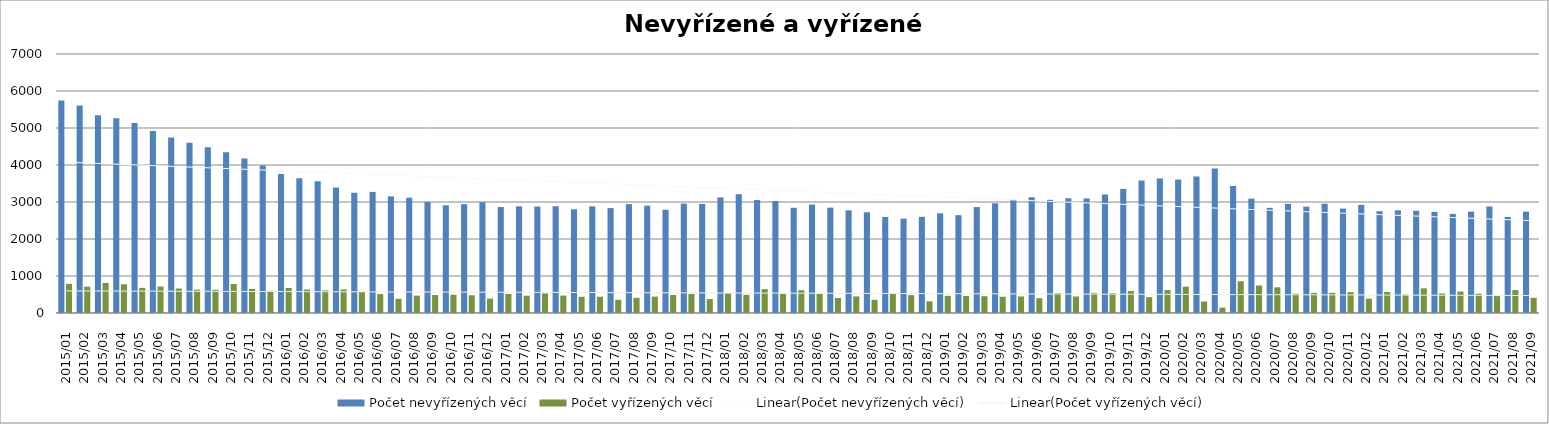
| Category | Počet nevyřízených věcí | Počet vyřízených věcí |
|---|---|---|
| 2015/01 | 5741 | 788 |
| 2015/02 | 5609 | 712 |
| 2015/03 | 5342 | 813 |
| 2015/04 | 5262 | 777 |
| 2015/05 | 5135 | 679 |
| 2015/06 | 4916 | 716 |
| 2015/07 | 4746 | 661 |
| 2015/08 | 4600 | 631 |
| 2015/09 | 4477 | 627 |
| 2015/10 | 4346 | 783 |
| 2015/11 | 4179 | 649 |
| 2015/12 | 3985 | 601 |
| 2016/01 | 3754 | 675 |
| 2016/02 | 3640 | 633 |
| 2016/03 | 3558 | 612 |
| 2016/04 | 3391 | 638 |
| 2016/05 | 3249 | 568 |
| 2016/06 | 3273 | 511 |
| 2016/07 | 3153 | 382 |
| 2016/08 | 3116 | 470 |
| 2016/09 | 3002 | 485 |
| 2016/10 | 2912 | 494 |
| 2016/11 | 2942 | 479 |
| 2016/12 | 2996 | 389 |
| 2017/01 | 2864 | 514 |
| 2017/02 | 2883 | 467 |
| 2017/03 | 2878 | 527 |
| 2017/04 | 2886 | 470 |
| 2017/05 | 2803 | 439 |
| 2017/06 | 2883 | 440 |
| 2017/07 | 2835 | 357 |
| 2017/08 | 2942 | 409 |
| 2017/09 | 2900 | 443 |
| 2017/10 | 2790 | 487 |
| 2017/11 | 2957 | 516 |
| 2017/12 | 2947 | 376 |
| 2018/01 | 3124 | 533 |
| 2018/02 | 3211 | 491 |
| 2018/03 | 3053 | 644 |
| 2018/04 | 3028 | 514 |
| 2018/05 | 2844 | 614 |
| 2018/06 | 2932 | 513 |
| 2018/07 | 2847 | 406 |
| 2018/08 | 2775 | 448 |
| 2018/09 | 2724 | 357 |
| 2018/10 | 2595 | 535 |
| 2018/11 | 2550 | 483 |
| 2018/12 | 2599 | 316 |
| 2019/01 | 2695 | 464 |
| 2019/02 | 2643 | 462 |
| 2019/03 | 2863 | 454 |
| 2019/04 | 2965 | 440 |
| 2019/05 | 3060 | 448 |
| 2019/06 | 3129 | 401 |
| 2019/07 | 3060 | 536 |
| 2019/08 | 3101 | 446 |
| 2019/09 | 3097 | 543 |
| 2019/10 | 3203 | 536 |
| 2019/11 | 3355 | 596 |
| 2019/12 | 3584 | 428 |
| 2020/01 | 3636 | 619 |
| 2020/02 | 3608 | 712 |
| 2020/03 | 3686 | 311 |
| 2020/04 | 3904 | 145 |
| 2020/05 | 3433 | 858 |
| 2020/06 | 3091 | 745 |
| 2020/07 | 2842 | 694 |
| 2020/08 | 2949 | 522 |
| 2020/09 | 2875 | 543 |
| 2020/10 | 2953 | 545 |
| 2020/11 | 2821 | 564 |
| 2020/12 | 2922 | 386 |
| 2021/01 | 2752 | 568 |
| 2021/02 | 2776 | 497 |
| 2021/03 | 2763 | 667 |
| 2021/04 | 2734 | 527 |
| 2021/05 | 2678 | 579 |
| 2021/06 | 2739 | 520 |
| 2021/07 | 2879 | 457 |
| 2021/08 | 2597 | 620 |
| 2021/09 | 2740 | 409 |